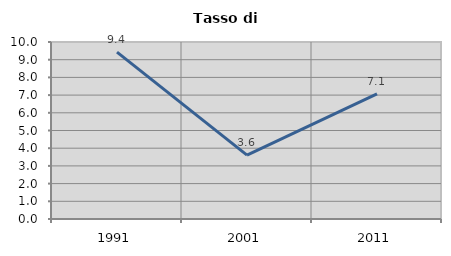
| Category | Tasso di disoccupazione   |
|---|---|
| 1991.0 | 9.424 |
| 2001.0 | 3.608 |
| 2011.0 | 7.071 |